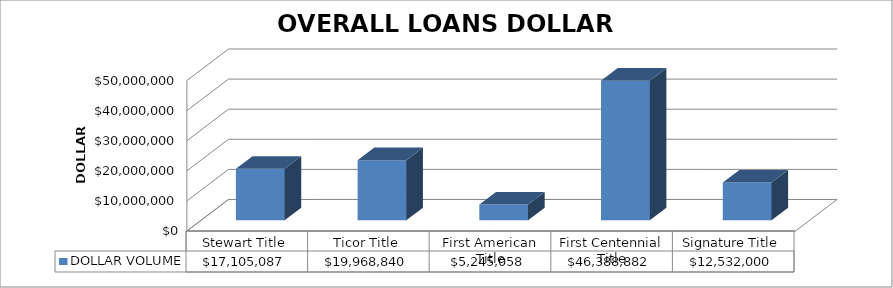
| Category | DOLLAR VOLUME |
|---|---|
| Stewart Title | 17105086.81 |
| Ticor Title | 19968840 |
| First American Title | 5245058 |
| First Centennial Title | 46388882 |
| Signature Title | 12532000 |